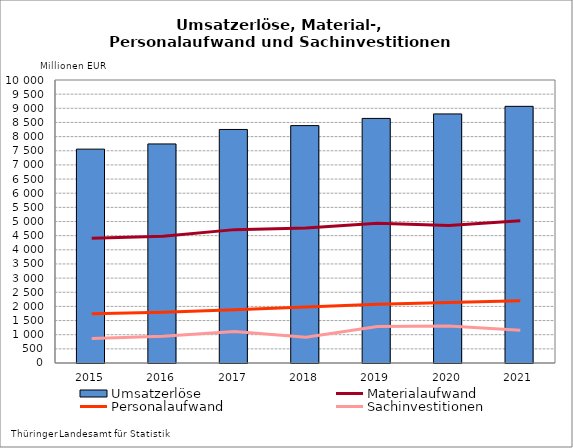
| Category | Umsatzerlöse |
|---|---|
| 2015.0 | 7557.268 |
| 2016.0 | 7740.227 |
| 2017.0 | 8252.208 |
| 2018.0 | 8388.485 |
| 2019.0 | 8642.783 |
| 2020.0 | 8801.101 |
| 2021.0 | 9069.574 |